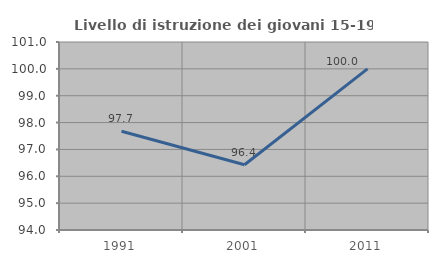
| Category | Livello di istruzione dei giovani 15-19 anni |
|---|---|
| 1991.0 | 97.674 |
| 2001.0 | 96.429 |
| 2011.0 | 100 |